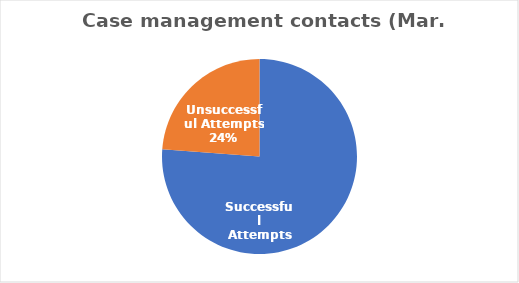
| Category | Series 0 |
|---|---|
| Successful Attempts | 259 |
| Unsuccessful Attempts | 81 |